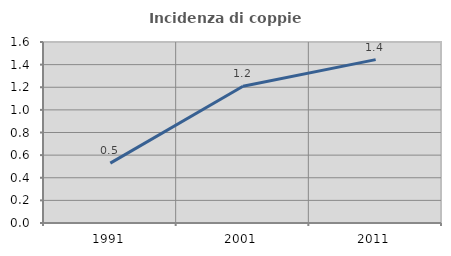
| Category | Incidenza di coppie miste |
|---|---|
| 1991.0 | 0.529 |
| 2001.0 | 1.209 |
| 2011.0 | 1.444 |